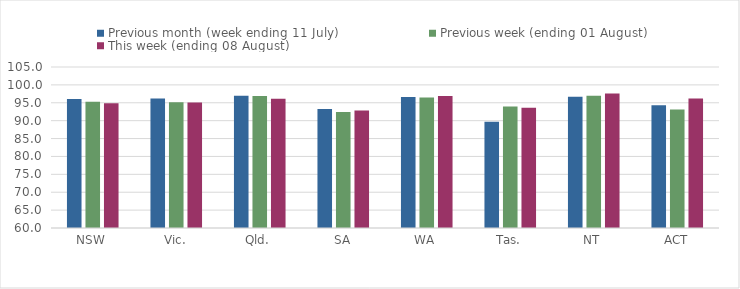
| Category | Previous month (week ending 11 July) | Previous week (ending 01 August) | This week (ending 08 August) |
|---|---|---|---|
| NSW | 96.072 | 95.261 | 94.884 |
| Vic. | 96.215 | 95.138 | 95.066 |
| Qld. | 96.972 | 96.908 | 96.123 |
| SA | 93.235 | 92.453 | 92.871 |
| WA | 96.586 | 96.497 | 96.861 |
| Tas. | 89.702 | 93.936 | 93.592 |
| NT | 96.695 | 96.983 | 97.603 |
| ACT | 94.283 | 93.12 | 96.169 |